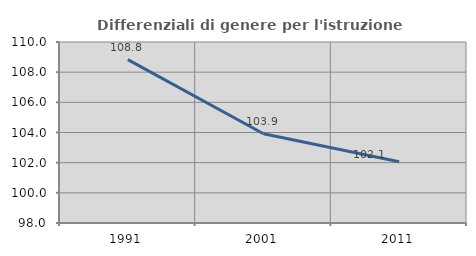
| Category | Differenziali di genere per l'istruzione superiore |
|---|---|
| 1991.0 | 108.832 |
| 2001.0 | 103.92 |
| 2011.0 | 102.062 |